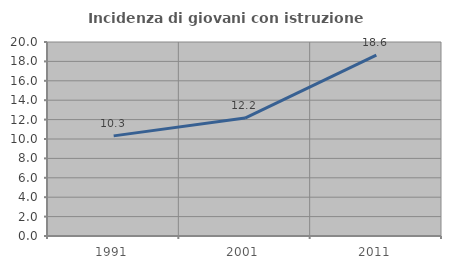
| Category | Incidenza di giovani con istruzione universitaria |
|---|---|
| 1991.0 | 10.322 |
| 2001.0 | 12.158 |
| 2011.0 | 18.644 |